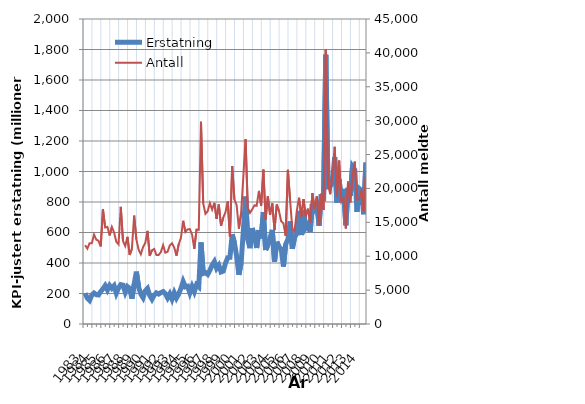
| Category | Erstatning |
|---|---|
| 1983.0 | 201.799 |
| nan | 169.038 |
| nan | 154.585 |
| nan | 189.36 |
| 1984.0 | 203.057 |
| nan | 192.077 |
| nan | 190.441 |
| nan | 213.009 |
| 1985.0 | 230.184 |
| nan | 251.598 |
| nan | 222.945 |
| nan | 252.85 |
| 1986.0 | 234.431 |
| nan | 250.851 |
| nan | 201.901 |
| nan | 236.27 |
| 1987.0 | 258.121 |
| nan | 254.718 |
| nan | 208.446 |
| nan | 245.243 |
| 1988.0 | 233.422 |
| nan | 166.394 |
| nan | 259.163 |
| nan | 343.318 |
| 1989.0 | 242.547 |
| nan | 196.036 |
| nan | 172.495 |
| nan | 217.622 |
| 1990.0 | 233.016 |
| nan | 187.462 |
| nan | 162.579 |
| nan | 189.236 |
| 1991.0 | 204.204 |
| nan | 196.341 |
| nan | 205.484 |
| nan | 212.445 |
| 1992.0 | 198.463 |
| nan | 171.007 |
| nan | 197.593 |
| nan | 163.054 |
| 1993.0 | 204.588 |
| nan | 170.263 |
| nan | 196.708 |
| nan | 232.712 |
| 1994.0 | 278.723 |
| nan | 243.667 |
| nan | 247.563 |
| nan | 204.054 |
| 1995.0 | 245.842 |
| nan | 211.497 |
| nan | 256.991 |
| nan | 244 |
| 1996.0 | 535.09 |
| nan | 331.337 |
| nan | 337.257 |
| nan | 325.257 |
| 1997.0 | 352.12 |
| nan | 386.392 |
| nan | 409.193 |
| nan | 365.095 |
| 1998.0 | 385.166 |
| nan | 341.221 |
| nan | 346.795 |
| nan | 398.602 |
| 1999.0 | 434.76 |
| nan | 436.872 |
| nan | 587.867 |
| nan | 532.391 |
| 2000.0 | 443.784 |
| nan | 322.284 |
| nan | 399.541 |
| nan | 609.178 |
| 2001.0 | 836.026 |
| nan | 553.453 |
| nan | 497.074 |
| nan | 628.9 |
| 2002.0 | 572.775 |
| nan | 498.37 |
| nan | 615.9 |
| nan | 561.222 |
| 2003.0 | 734.001 |
| nan | 485.295 |
| nan | 516.292 |
| nan | 562.424 |
| 2004.0 | 617.01 |
| nan | 407.925 |
| nan | 539.294 |
| nan | 504.074 |
| 2005.0 | 493.365 |
| nan | 376.506 |
| nan | 522.692 |
| nan | 553.922 |
| 2006.0 | 673.302 |
| nan | 493.774 |
| nan | 568.148 |
| nan | 592.735 |
| 2007.0 | 741.926 |
| nan | 583.311 |
| nan | 745.277 |
| nan | 630.118 |
| 2008.0 | 651.624 |
| nan | 603.24 |
| nan | 787.866 |
| nan | 756.664 |
| 2009.0 | 794.035 |
| nan | 644.63 |
| nan | 851.539 |
| nan | 804.882 |
| 2010.0 | 1765.585 |
| nan | 900.536 |
| nan | 904.868 |
| nan | 925.719 |
| 2011.0 | 1094.03 |
| nan | 795.553 |
| nan | 948.575 |
| nan | 799.425 |
| 2012.0 | 885.653 |
| nan | 647.494 |
| nan | 892.713 |
| nan | 840.573 |
| 2013.0 | 1032.312 |
| nan | 1010.828 |
| nan | 735.525 |
| nan | 888.429 |
| 2014.0 | 876.23 |
| nan | 719.557 |
| nan | 1058.507 |